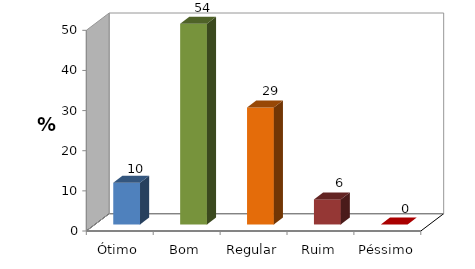
| Category | Series 0 |
|---|---|
| Ótimo | 10.417 |
| Bom | 54.167 |
| Regular | 29.167 |
| Ruim | 6.25 |
| Péssimo | 0 |